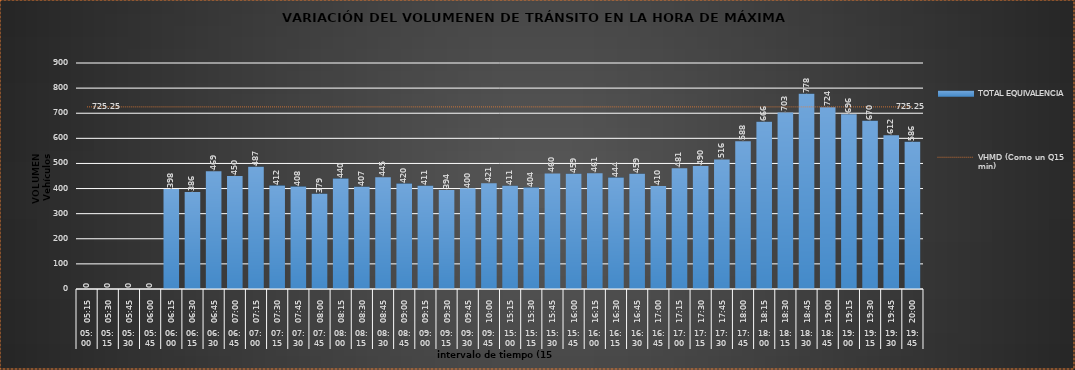
| Category | TOTAL EQUIVALENCIA   |
|---|---|
| 0 | 0 |
| 1 | 0 |
| 2 | 0 |
| 3 | 0 |
| 4 | 398 |
| 5 | 386 |
| 6 | 469 |
| 7 | 450 |
| 8 | 487 |
| 9 | 412 |
| 10 | 408 |
| 11 | 379 |
| 12 | 440 |
| 13 | 407 |
| 14 | 445 |
| 15 | 420 |
| 16 | 411 |
| 17 | 394 |
| 18 | 400 |
| 19 | 421 |
| 20 | 411 |
| 21 | 404 |
| 22 | 460 |
| 23 | 459 |
| 24 | 461 |
| 25 | 444 |
| 26 | 459 |
| 27 | 410 |
| 28 | 481 |
| 29 | 490 |
| 30 | 516 |
| 31 | 588 |
| 32 | 666 |
| 33 | 703 |
| 34 | 778 |
| 35 | 724 |
| 36 | 696 |
| 37 | 670 |
| 38 | 612 |
| 39 | 586 |